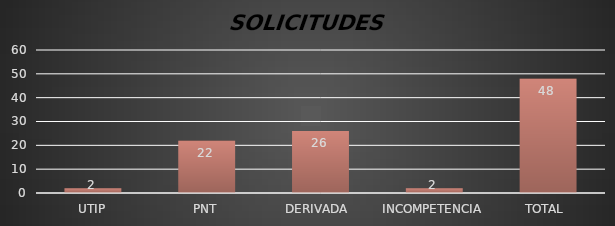
| Category | Series 1 |
|---|---|
| UTIP | 2 |
| PNT | 22 |
| DERIVADA  | 26 |
| INCOMPETENCIA | 2 |
| TOTAL  | 48 |